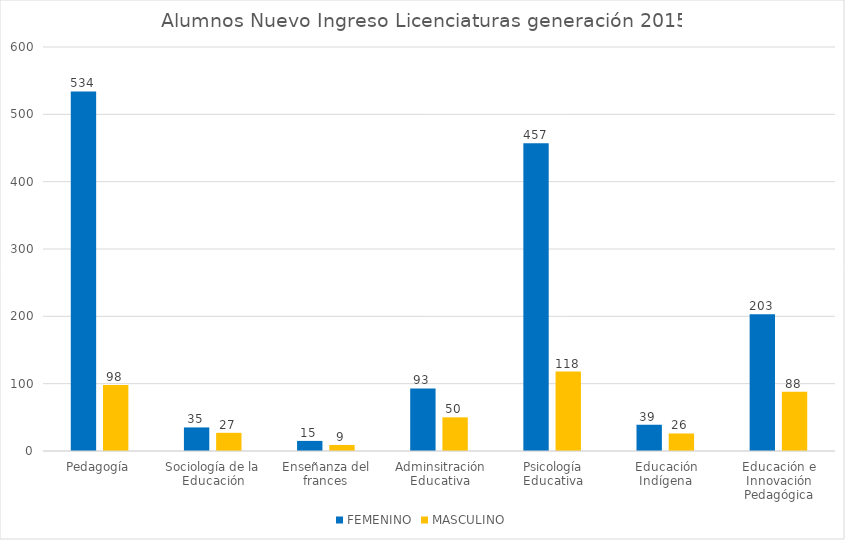
| Category | FEMENINO | MASCULINO |
|---|---|---|
| Pedagogía | 534 | 98 |
| Sociología de la Educación | 35 | 27 |
| Enseñanza del frances | 15 | 9 |
| Adminsitración Educativa | 93 | 50 |
| Psicología Educativa | 457 | 118 |
| Educación Indígena | 39 | 26 |
| Educación e Innovación Pedagógica | 203 | 88 |